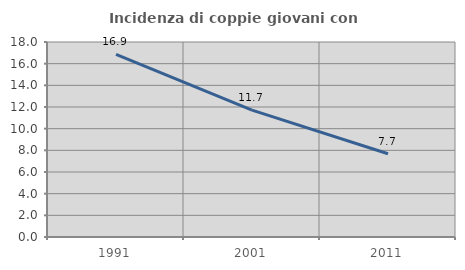
| Category | Incidenza di coppie giovani con figli |
|---|---|
| 1991.0 | 16.865 |
| 2001.0 | 11.717 |
| 2011.0 | 7.681 |